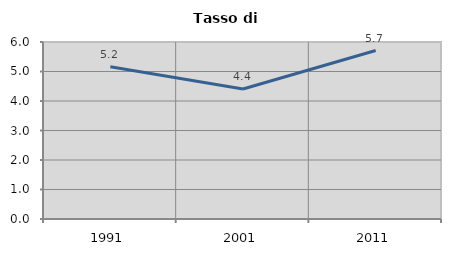
| Category | Tasso di disoccupazione   |
|---|---|
| 1991.0 | 5.164 |
| 2001.0 | 4.408 |
| 2011.0 | 5.71 |